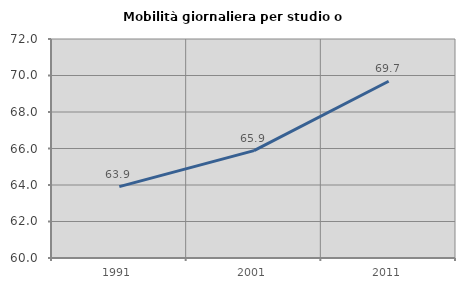
| Category | Mobilità giornaliera per studio o lavoro |
|---|---|
| 1991.0 | 63.909 |
| 2001.0 | 65.884 |
| 2011.0 | 69.686 |